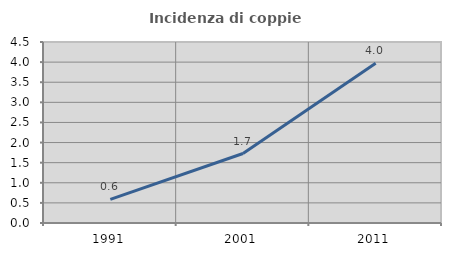
| Category | Incidenza di coppie miste |
|---|---|
| 1991.0 | 0.588 |
| 2001.0 | 1.727 |
| 2011.0 | 3.972 |